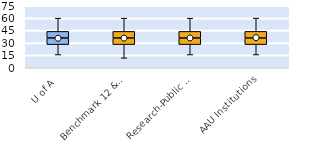
| Category | 25th | 50th | 75th |
|---|---|---|---|
| U of A | 28 | 8 | 8 |
| Benchmark 12 & SEC | 28 | 8 | 8 |
| Research-Public Univ | 28 | 8 | 8 |
| AAU Institutions | 28 | 8 | 8 |